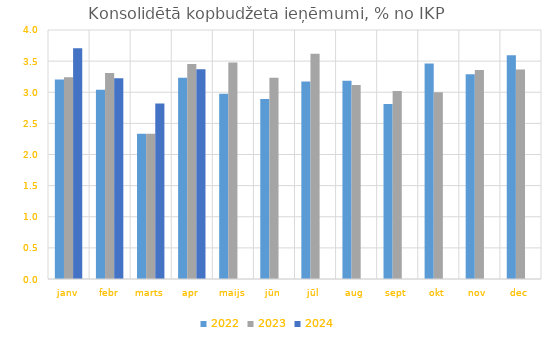
| Category | 2022 | 2023 | 2024 |
|---|---|---|---|
| janv | 3.205 | 3.241 | 3.707 |
| febr | 3.039 | 3.309 | 3.226 |
| marts | 2.335 | 2.335 | 2.817 |
| apr | 3.232 | 3.452 | 3.37 |
| maijs | 2.974 | 3.476 | 0 |
| jūn | 2.892 | 3.232 | 0 |
| jūl | 3.172 | 3.618 | 0 |
| aug | 3.184 | 3.118 | 0 |
| sept | 2.811 | 3.018 | 0 |
| okt | 3.461 | 2.998 | 0 |
| nov | 3.287 | 3.356 | 0 |
| dec | 3.594 | 3.367 | 0 |